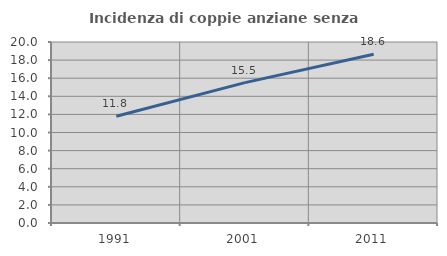
| Category | Incidenza di coppie anziane senza figli  |
|---|---|
| 1991.0 | 11.795 |
| 2001.0 | 15.512 |
| 2011.0 | 18.641 |